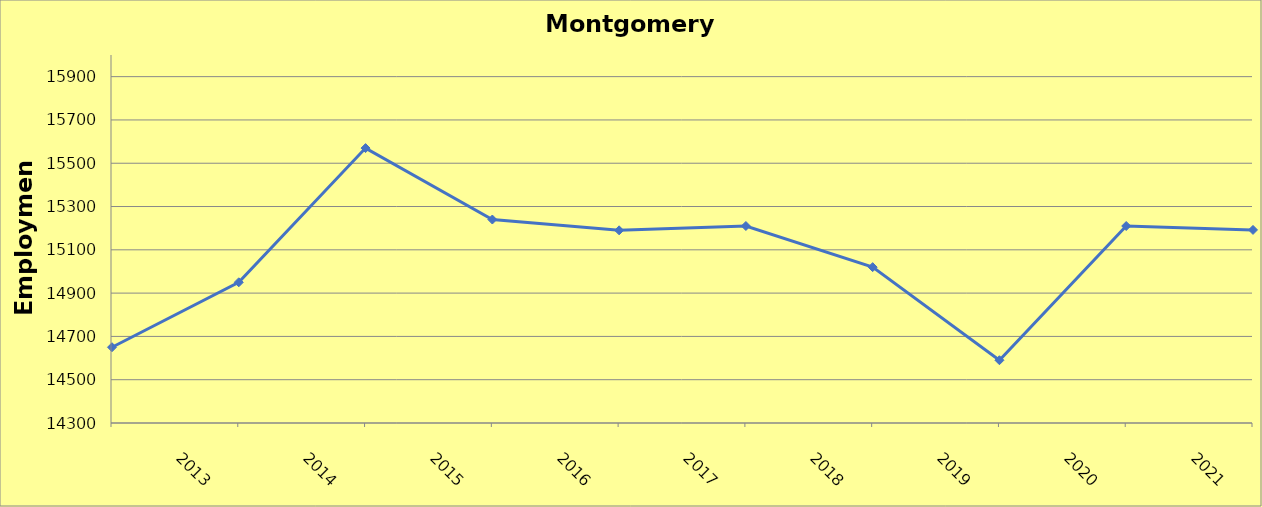
| Category | Montgomery County |
|---|---|
| 2013.0 | 14650 |
| 2014.0 | 14950 |
| 2015.0 | 15570 |
| 2016.0 | 15240 |
| 2017.0 | 15190 |
| 2018.0 | 15210 |
| 2019.0 | 15020 |
| 2020.0 | 14590 |
| 2021.0 | 15210 |
| 2022.0 | 15192 |